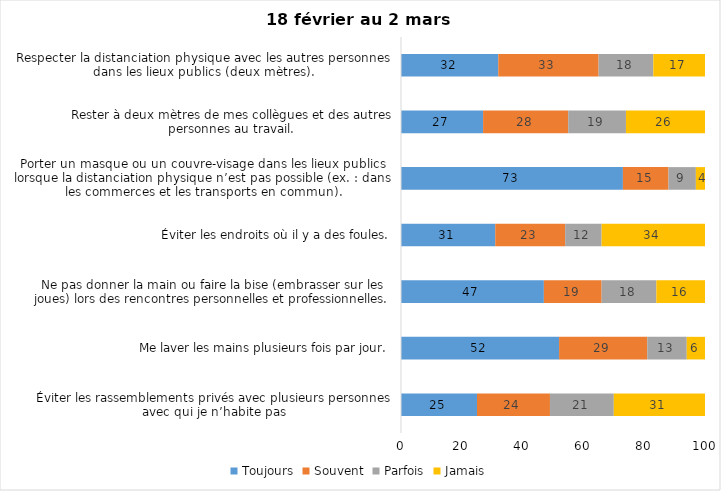
| Category | Toujours | Souvent | Parfois | Jamais |
|---|---|---|---|---|
| Éviter les rassemblements privés avec plusieurs personnes avec qui je n’habite pas | 25 | 24 | 21 | 31 |
| Me laver les mains plusieurs fois par jour. | 52 | 29 | 13 | 6 |
| Ne pas donner la main ou faire la bise (embrasser sur les joues) lors des rencontres personnelles et professionnelles. | 47 | 19 | 18 | 16 |
| Éviter les endroits où il y a des foules. | 31 | 23 | 12 | 34 |
| Porter un masque ou un couvre-visage dans les lieux publics lorsque la distanciation physique n’est pas possible (ex. : dans les commerces et les transports en commun). | 73 | 15 | 9 | 4 |
| Rester à deux mètres de mes collègues et des autres personnes au travail. | 27 | 28 | 19 | 26 |
| Respecter la distanciation physique avec les autres personnes dans les lieux publics (deux mètres). | 32 | 33 | 18 | 17 |